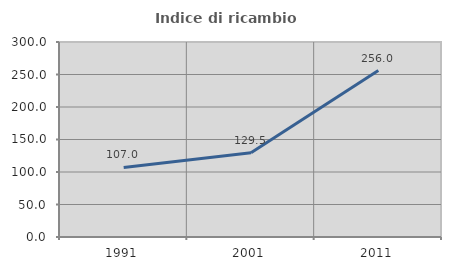
| Category | Indice di ricambio occupazionale  |
|---|---|
| 1991.0 | 106.965 |
| 2001.0 | 129.511 |
| 2011.0 | 256.019 |